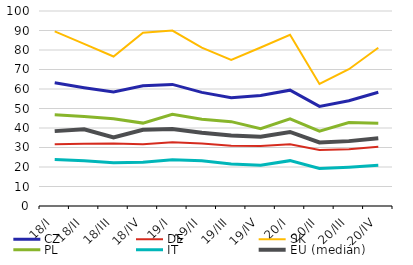
| Category | CZ | DE | SK | PL | IT | EU (medián) |
|---|---|---|---|---|---|---|
| 18/I | 63.216 | 31.72 | 89.531 | 46.758 | 23.802 | 38.398 |
| 18/II | 60.663 | 31.869 | 83.181 | 45.902 | 23.244 | 39.329 |
| 18/III | 58.444 | 32.009 | 76.658 | 44.77 | 22.141 | 35.159 |
| 18/IV | 61.607 | 31.724 | 88.878 | 42.511 | 22.41 | 39.051 |
| 19/I | 62.361 | 32.666 | 89.992 | 47.004 | 23.659 | 39.474 |
| 19/II | 58.251 | 32.009 | 81.249 | 44.514 | 23.145 | 37.525 |
| 19/III | 55.506 | 30.874 | 74.911 | 43.264 | 21.507 | 36.183 |
| 19/IV | 56.679 | 30.708 | 81.283 | 39.695 | 20.896 | 35.492 |
| 20/I | 59.393 | 31.632 | 87.782 | 44.712 | 23.257 | 37.957 |
| 20/II | 51.071 | 28.766 | 62.579 | 38.37 | 19.235 | 32.613 |
| 20/III | 53.963 | 29.057 | 70.162 | 42.765 | 19.9 | 33.267 |
| 20/IV | 58.335 | 30.429 | 81.142 | 42.412 | 20.849 | 34.724 |